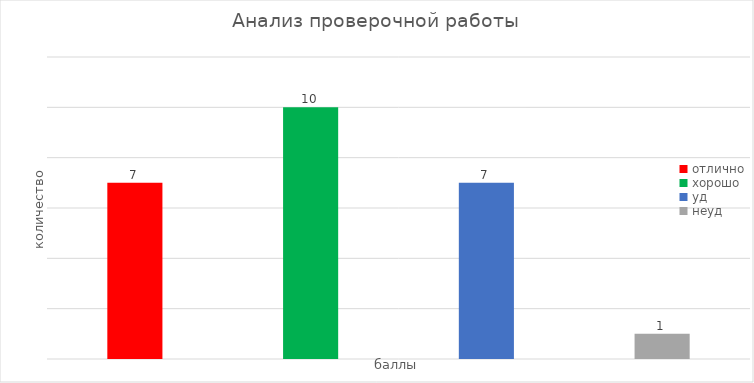
| Category | Series 0 |
|---|---|
| отлично | 7 |
| хорошо | 10 |
| уд | 7 |
| неуд | 1 |